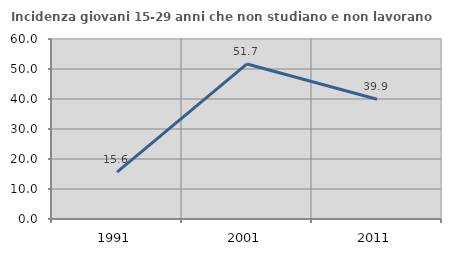
| Category | Incidenza giovani 15-29 anni che non studiano e non lavorano  |
|---|---|
| 1991.0 | 15.607 |
| 2001.0 | 51.68 |
| 2011.0 | 39.933 |